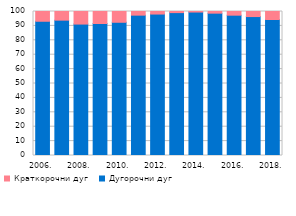
| Category | Дугорочни дуг | Краткорочни дуг |
|---|---|---|
| 2006. | 93.225 | 6.775 |
| 2007. | 93.994 | 6.006 |
| 2008. | 91.269 | 8.731 |
| 2009. | 91.683 | 8.317 |
| 2010. | 92.524 | 7.476 |
| 2011. | 97.465 | 2.535 |
| 2012. | 98.226 | 1.774 |
| 2013. | 99.234 | 0.766 |
| 2014. | 99.616 | 0.384 |
| 2015. | 98.846 | 1.154 |
| 2016. | 97.448 | 2.552 |
| 2017. | 96.488 | 3.512 |
| 2018. | 94.424 | 5.576 |